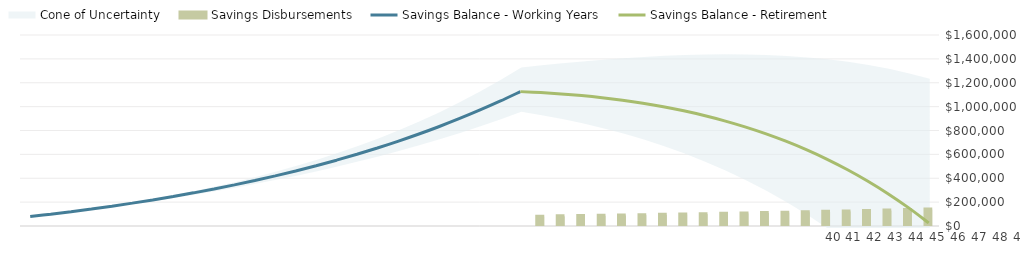
| Category |  Savings Disbursements |
|---|---|
| 0 | 0 |
| 1 | 0 |
| 2 | 0 |
| 3 | 0 |
| 4 | 0 |
| 5 | 0 |
| 6 | 0 |
| 7 | 0 |
| 8 | 0 |
| 9 | 0 |
| 10 | 0 |
| 11 | 0 |
| 12 | 0 |
| 13 | 0 |
| 14 | 0 |
| 15 | 0 |
| 16 | 0 |
| 17 | 0 |
| 18 | 0 |
| 19 | 0 |
| 20 | 0 |
| 21 | 0 |
| 22 | 0 |
| 23 | 0 |
| 24 | 0 |
| 25 | 78516.672 |
| 26 | 80872.173 |
| 27 | 83298.338 |
| 28 | 85797.288 |
| 29 | 88371.206 |
| 30 | 91022.343 |
| 31 | 93753.013 |
| 32 | 96565.603 |
| 33 | 99462.571 |
| 34 | 102446.449 |
| 35 | 105519.842 |
| 36 | 108685.437 |
| 37 | 111946 |
| 38 | 115304.38 |
| 39 | 118763.512 |
| 40 | 122326.417 |
| 41 | 125996.21 |
| 42 | 129776.096 |
| 43 | 133669.379 |
| 44 | 137679.46 |